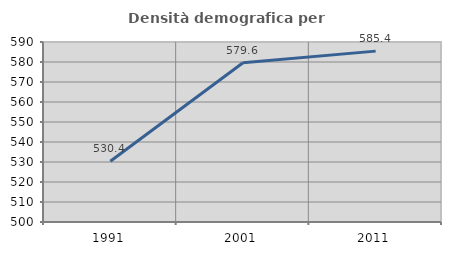
| Category | Densità demografica |
|---|---|
| 1991.0 | 530.38 |
| 2001.0 | 579.632 |
| 2011.0 | 585.439 |